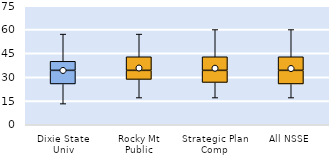
| Category | 25th | 50th | 75th |
|---|---|---|---|
| Dixie State Univ | 25.714 | 8.571 | 5.714 |
| Rocky Mt Public | 28.571 | 5.714 | 8.571 |
| Strategic Plan Comp | 26.667 | 7.619 | 8.571 |
| All NSSE | 25.714 | 8.571 | 8.571 |